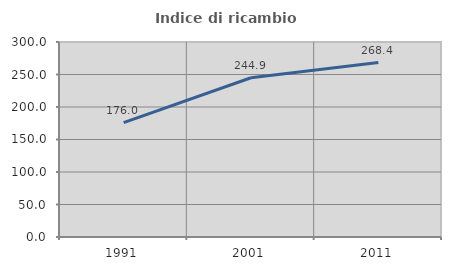
| Category | Indice di ricambio occupazionale  |
|---|---|
| 1991.0 | 176.03 |
| 2001.0 | 244.948 |
| 2011.0 | 268.41 |